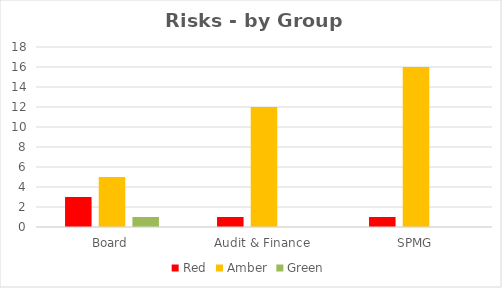
| Category | Red | Amber | Green |
|---|---|---|---|
| Board | 3 | 5 | 1 |
| Audit & Finance | 1 | 12 | 0 |
| SPMG | 1 | 16 | 0 |